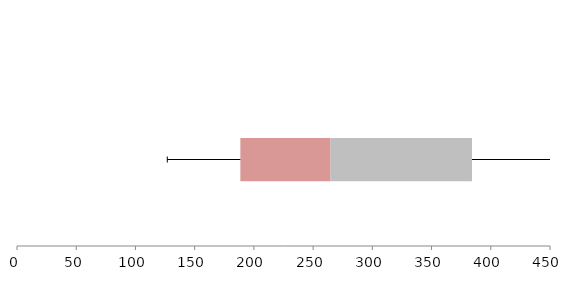
| Category | Series 1 | Series 2 | Series 3 |
|---|---|---|---|
| 0 | 188.568 | 76.191 | 119.376 |